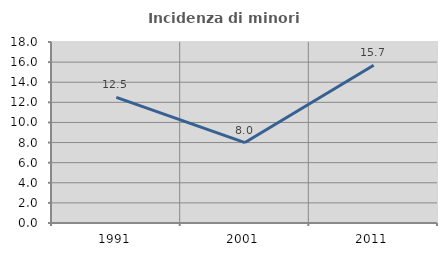
| Category | Incidenza di minori stranieri |
|---|---|
| 1991.0 | 12.5 |
| 2001.0 | 8 |
| 2011.0 | 15.686 |